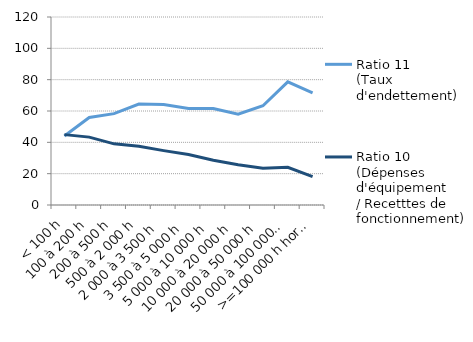
| Category | Ratio 11
(Taux d'endettement) | Ratio 10 
(Dépenses d'équipement
/ Recetttes de fonctionnement) |
|---|---|---|
| < 100 h | 44.006 | 44.922 |
| 100 à 200 h | 55.834 | 43.333 |
| 200 à 500 h | 58.302 | 39.038 |
| 500 à 2 000 h | 64.396 | 37.492 |
| 2 000 à 3 500 h | 64.113 | 34.7 |
| 3 500 à 5 000 h | 61.551 | 32.252 |
| 5 000 à 10 000 h | 61.596 | 28.568 |
| 10 000 à 20 000 h | 57.948 | 25.718 |
| 20 000 à 50 000 h | 63.349 | 23.501 |
| 50 000 à 100 000 h | 78.615 | 24.085 |
| >=100 000 h hors Paris | 71.563 | 18.101 |